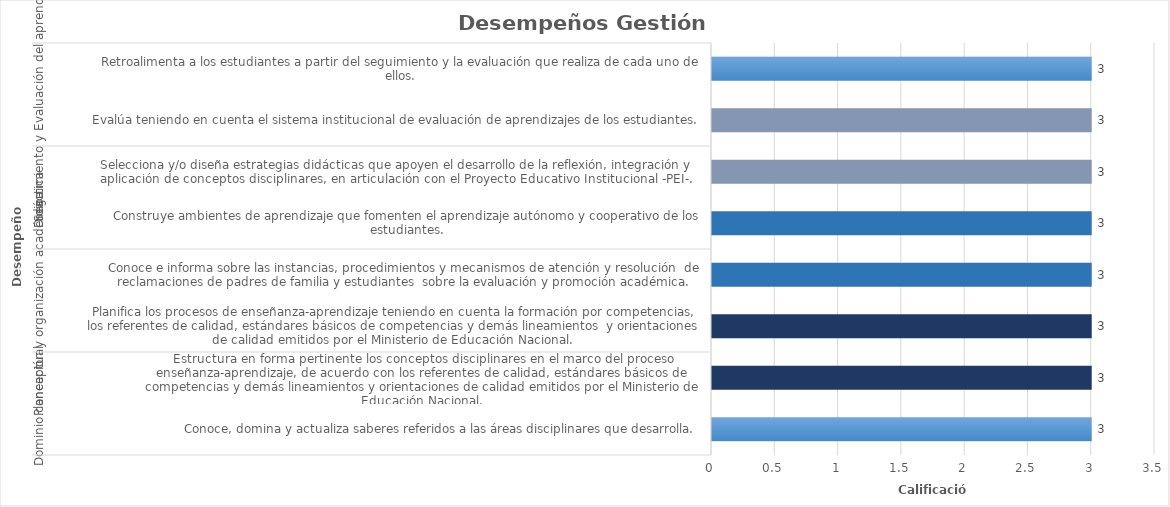
| Category | Series 0 |
|---|---|
| 0 | 3 |
| 1 | 3 |
| 2 | 3 |
| 3 | 3 |
| 4 | 3 |
| 5 | 3 |
| 6 | 3 |
| 7 | 3 |